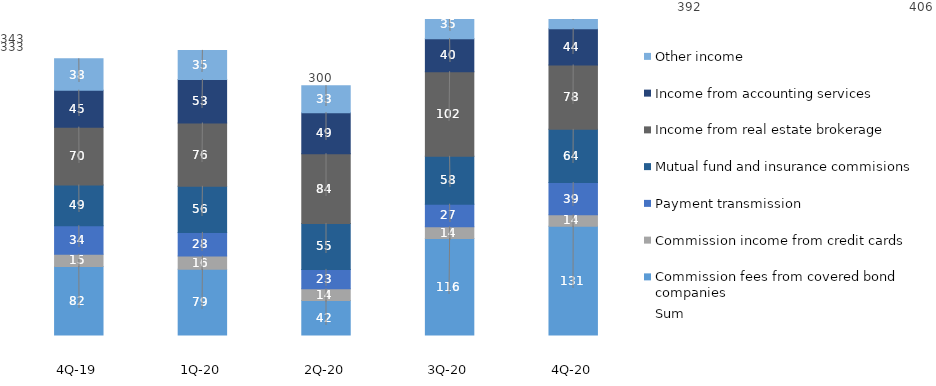
| Category | Commission fees from covered bond companies | Commission income from credit cards | Payment transmission | Mutual fund and insurance commisions | Income from real estate brokerage | Income from accounting services | Other income |
|---|---|---|---|---|---|---|---|
| 4Q-20 | 131.015 | 13.687 | 38.872 | 64.05 | 77.589 | 43.624 | 37.225 |
| 3Q-20 | 116.034 | 14.295 | 27.183 | 57.628 | 101.952 | 39.804 | 35.242 |
| 2Q-20 | 41.55 | 14.097 | 23.262 | 55.386 | 84.016 | 49.478 | 32.501 |
| 1Q-20 | 78.983 | 16.14 | 28.326 | 55.562 | 76.287 | 52.513 | 34.973 |
| 4Q-19 | 82.3 | 14.8 | 34.4 | 49.1 | 69.7 | 44.5 | 37.8 |